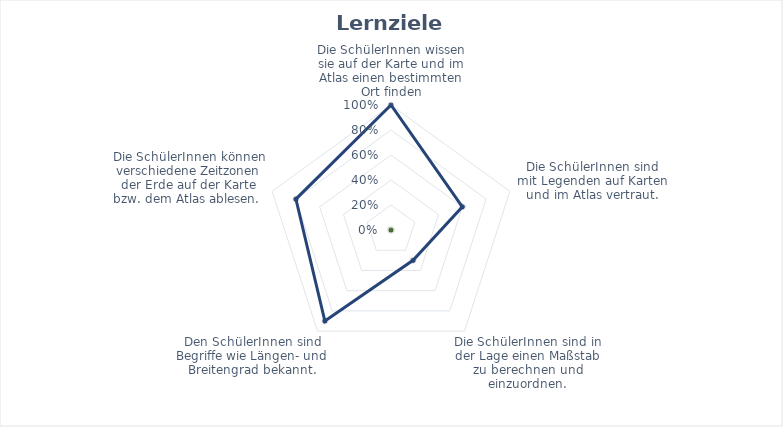
| Category | Series 0 | Series 1 | Series 2 | Series 3 | Series 4 |
|---|---|---|---|---|---|
| 0 |  |  |  |  | 1 |
| 1 |  |  |  |  | 0.6 |
| 2 |  |  |  |  | 0.3 |
| 3 |  |  |  |  | 0.9 |
| 4 |  |  |  |  | 0.8 |